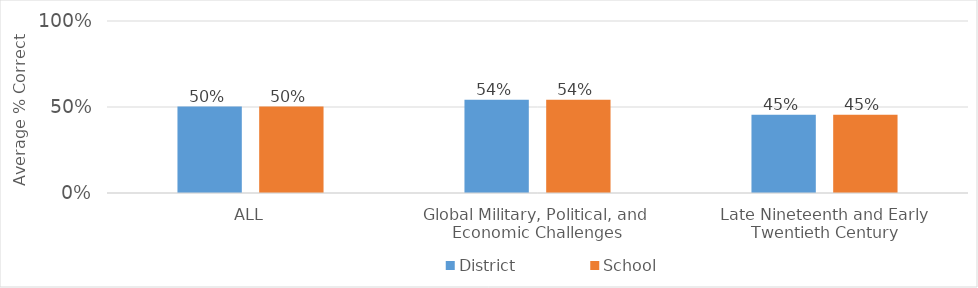
| Category | District | School |
|---|---|---|
| ALL | 50.22 | 50.22 |
| Global Military, Political, and Economic Challenges | 54.177 | 54.177 |
| Late Nineteenth and Early Twentieth Century | 45.452 | 45.452 |